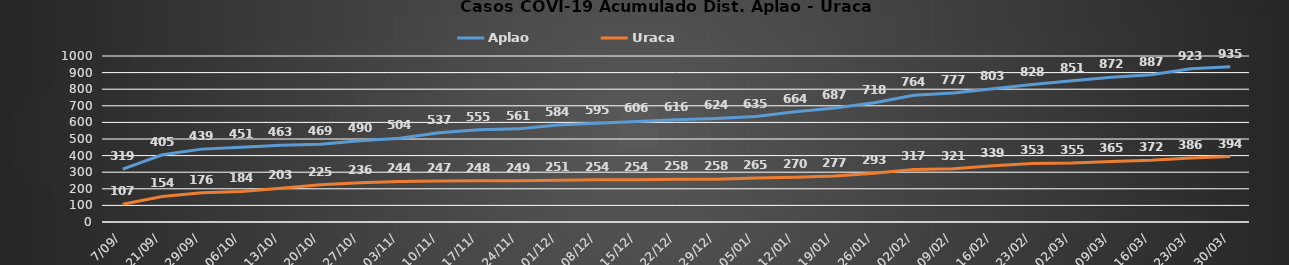
| Category | Aplao | Uraca |
|---|---|---|
| 7/09/ | 319 | 107 |
| 21/09/ | 405 | 154 |
| 29/09/ | 439 | 176 |
| 06/10/ | 451 | 184 |
| 13/10/ | 463 | 203 |
| 20/10/ | 469 | 225 |
| 27/10/ | 490 | 236 |
| 03/11/ | 504 | 244 |
| 10/11/ | 537 | 247 |
| 17/11/ | 555 | 248 |
| 24/11/ | 561 | 249 |
| 01/12/ | 584 | 251 |
| 08/12/ | 595 | 254 |
| 15/12/ | 606 | 254 |
| 22/12/ | 616 | 258 |
| 29/12/ | 624 | 258 |
| 05/01/ | 635 | 265 |
| 12/01/ | 664 | 270 |
| 19/01/ | 687 | 277 |
| 26/01/ | 718 | 293 |
| 02/02/ | 764 | 317 |
| 09/02/ | 777 | 321 |
| 16/02/ | 803 | 339 |
| 23/02/ | 828 | 353 |
| 02/03/ | 851 | 355 |
| 09/03/ | 872 | 365 |
| 16/03/ | 887 | 372 |
| 23/03/ | 923 | 386 |
| 30/03/ | 935 | 394 |